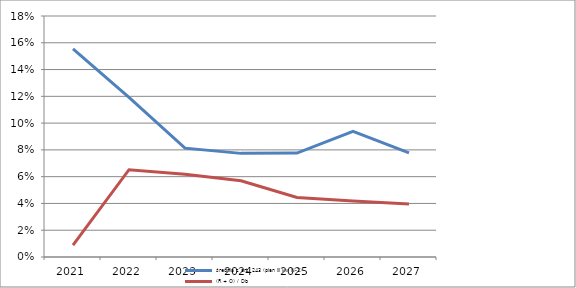
| Category | średnia z art. 243 (plan III kw N-1) | (R + O) / Db |
|---|---|---|
| 2021.0 | 0.156 | 0.009 |
| 2022.0 | 0.119 | 0.065 |
| 2023.0 | 0.081 | 0.062 |
| 2024.0 | 0.077 | 0.057 |
| 2025.0 | 0.078 | 0.044 |
| 2026.0 | 0.094 | 0.042 |
| 2027.0 | 0.078 | 0.04 |